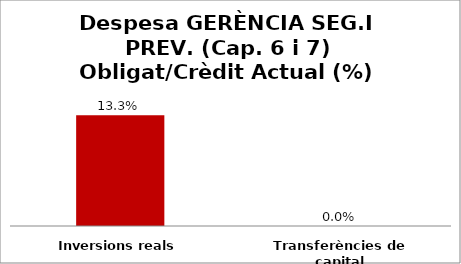
| Category | Series 0 |
|---|---|
| Inversions reals | 0.133 |
| Transferències de capital | 0 |